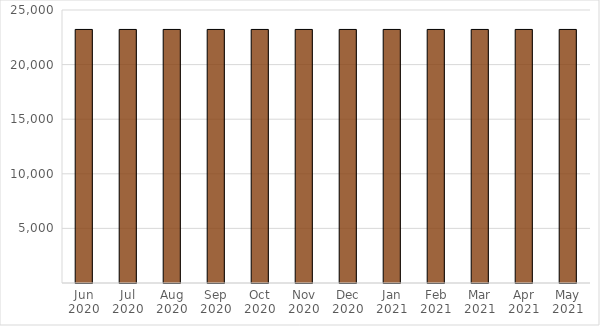
| Category | Total Other Expense |
|---|---|
| Jun 2020 | 23220 |
| Jul 2020 | 23220 |
| Aug 2020 | 23220 |
| Sep 2020 | 23220 |
| Oct 2020 | 23220 |
| Nov 2020 | 23220 |
| Dec 2020 | 23220 |
| Jan 2021 | 23220 |
| Feb 2021 | 23220 |
| Mar 2021 | 23220 |
| Apr 2021 | 23220 |
| May 2021 | 23220 |